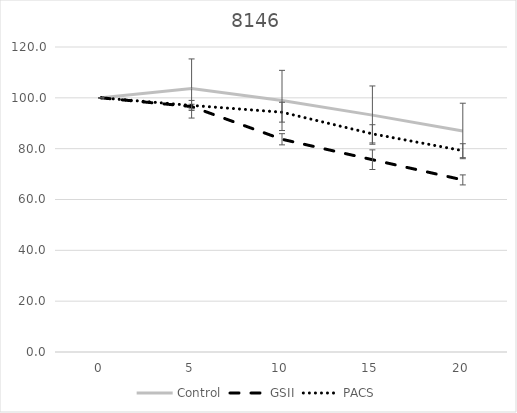
| Category | Control | GSII | PACS |
|---|---|---|---|
| 0.0 | 100 | 100 | 100 |
| 5.0 | 103.676 | 96.57 | 97.019 |
| 10.0 | 98.973 | 83.697 | 94.346 |
| 15.0 | 93.203 | 75.663 | 85.84 |
| 20.0 | 86.968 | 67.707 | 79.208 |